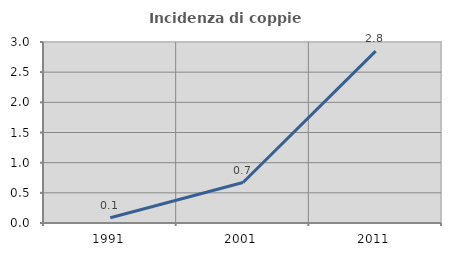
| Category | Incidenza di coppie miste |
|---|---|
| 1991.0 | 0.087 |
| 2001.0 | 0.671 |
| 2011.0 | 2.848 |